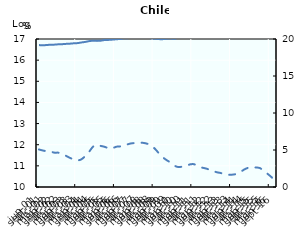
| Category | Tendencia |
|---|---|
| 0 | 16.713 |
| Jan-00 | 16.703 |
| Jan-00 | 16.715 |
| Jan-00 | 16.73 |
| Jan-00 | 16.734 |
| Jan-00 | 16.748 |
| Jan-00 | 16.755 |
| Jan-00 | 16.769 |
| Jan-00 | 16.779 |
| Jan-00 | 16.796 |
| Jan-00 | 16.806 |
| Jan-00 | 16.837 |
| Jan-00 | 16.863 |
| Jan-00 | 16.9 |
| Jan-00 | 16.919 |
| Jan-00 | 16.911 |
| Jan-00 | 16.922 |
| Jan-00 | 16.953 |
| Jan-00 | 16.958 |
| Jan-00 | 16.971 |
| Jan-00 | 16.989 |
| Jan-00 | 17.002 |
| Jan-00 | 17.034 |
| Jan-00 | 17.041 |
| Jan-00 | 17.047 |
| Jan-00 | 17.047 |
| Jan-00 | 17.066 |
| Jan-00 | 17.078 |
| Jan-00 | 17.061 |
| Jan-00 | 17.032 |
| Jan-00 | 17.013 |
| Jan-00 | 16.995 |
| Feb-00 | 16.994 |
| Feb-00 | 17.014 |
| Feb-00 | 17.028 |
| Feb-00 | 17.008 |
| Feb-00 | 17.062 |
| Feb-00 | 17.1 |
| Feb-00 | 17.106 |
| Feb-00 | 17.107 |
| Feb-00 | 17.11 |
| Feb-00 | 17.11 |
| Feb-00 | 17.127 |
| Feb-00 | 17.129 |
| Feb-00 | 17.148 |
| Feb-00 | 17.137 |
| Feb-00 | 17.149 |
| Feb-00 | 17.151 |
| Feb-00 | 17.146 |
| Feb-00 | 17.156 |
| Feb-00 | 17.166 |
| Feb-00 | 17.155 |
| Feb-00 | 17.147 |
| Feb-00 | 17.15 |
| Feb-00 | 17.15 |
| Feb-00 | 17.158 |
| Feb-00 | 17.153 |
| Feb-00 | 17.148 |
| Feb-00 | 17.143 |
| Feb-00 | 17.153 |
| Feb-00 | 17.134 |
| Mar-00 | 17.139 |